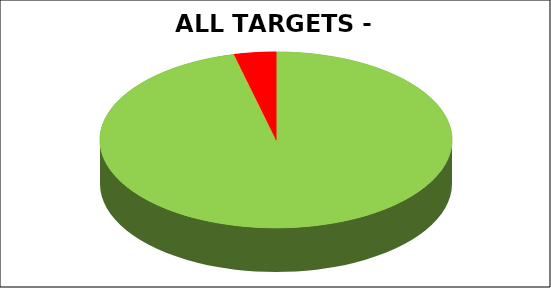
| Category | Series 0 |
|---|---|
| Green | 0.962 |
| Amber | 0 |
| Red | 0.038 |